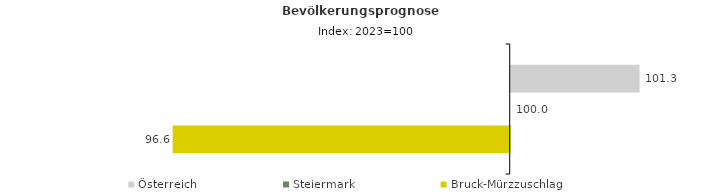
| Category | Österreich | Steiermark | Bruck-Mürzzuschlag |
|---|---|---|---|
| 2023.0 | 101.3 | 100 | 96.6 |